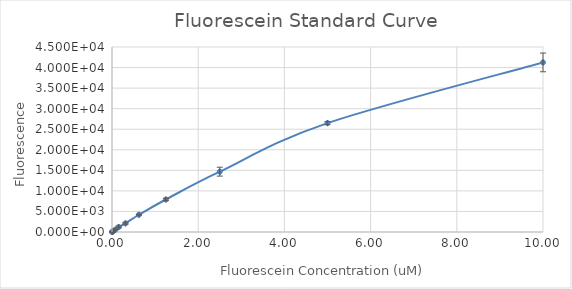
| Category | Series 0 |
|---|---|
| 10.0 | 41252 |
| 5.0 | 26490 |
| 2.5 | 14674 |
| 1.25 | 7907 |
| 0.625 | 4196.75 |
| 0.3125 | 2104.75 |
| 0.15625 | 1215.5 |
| 0.078125 | 566.75 |
| 0.0390625 | 305.5 |
| 0.01953125 | 146.25 |
| 0.009765625 | 86.75 |
| 0.0 | 0 |